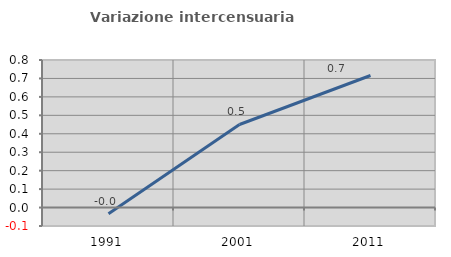
| Category | Variazione intercensuaria annua |
|---|---|
| 1991.0 | -0.034 |
| 2001.0 | 0.45 |
| 2011.0 | 0.716 |